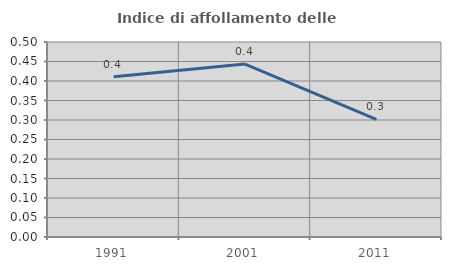
| Category | Indice di affollamento delle abitazioni  |
|---|---|
| 1991.0 | 0.411 |
| 2001.0 | 0.443 |
| 2011.0 | 0.302 |